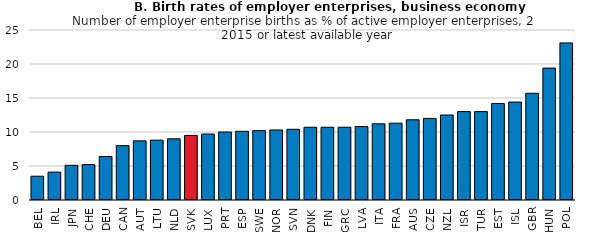
| Category | Series 0 |
|---|---|
| BEL | 3.5 |
| IRL | 4.1 |
| JPN | 5.1 |
| CHE | 5.2 |
| DEU | 6.4 |
| CAN | 8 |
| AUT | 8.7 |
| LTU | 8.8 |
| NLD | 9 |
| SVK | 9.5 |
| LUX | 9.7 |
| PRT | 10 |
| ESP | 10.1 |
| SWE | 10.2 |
| NOR | 10.3 |
| SVN | 10.4 |
| DNK | 10.7 |
| FIN | 10.7 |
| GRC | 10.7 |
| LVA | 10.8 |
| ITA | 11.2 |
| FRA | 11.3 |
| AUS | 11.8 |
| CZE | 12 |
| NZL | 12.5 |
| ISR | 13 |
| TUR | 13 |
| EST | 14.2 |
| ISL | 14.4 |
| GBR | 15.7 |
| HUN | 19.4 |
| POL | 23.1 |